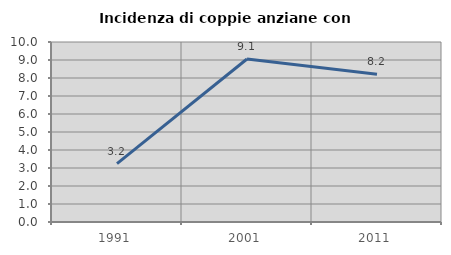
| Category | Incidenza di coppie anziane con figli |
|---|---|
| 1991.0 | 3.247 |
| 2001.0 | 9.053 |
| 2011.0 | 8.205 |